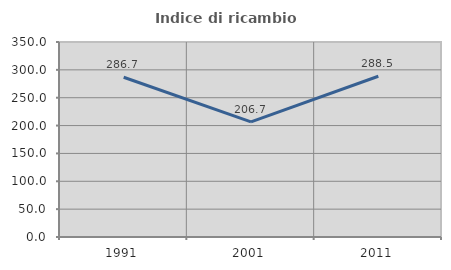
| Category | Indice di ricambio occupazionale  |
|---|---|
| 1991.0 | 286.667 |
| 2001.0 | 206.667 |
| 2011.0 | 288.462 |